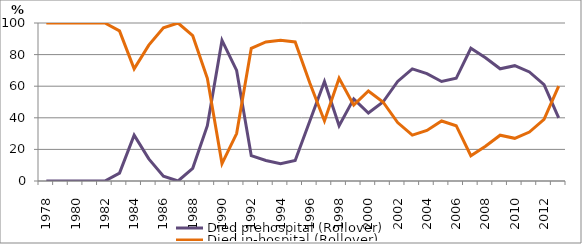
| Category | Died prehospital (Rollover) | Died in-hospital (Rollover) |
|---|---|---|
| 1978.0 | 0 | 100 |
| 1979.0 | 0 | 100 |
| 1980.0 | 0 | 100 |
| 1981.0 | 0 | 100 |
| 1982.0 | 0 | 100 |
| 1983.0 | 5 | 95 |
| 1984.0 | 29 | 71 |
| 1985.0 | 14 | 86 |
| 1986.0 | 3 | 97 |
| 1987.0 | 0 | 100 |
| 1988.0 | 8 | 92 |
| 1989.0 | 35 | 65 |
| 1990.0 | 89 | 11 |
| 1991.0 | 70 | 30 |
| 1992.0 | 16 | 84 |
| 1993.0 | 13 | 88 |
| 1994.0 | 11 | 89 |
| 1995.0 | 13 | 88 |
| 1996.0 | 38 | 62 |
| 1997.0 | 63 | 38 |
| 1998.0 | 35 | 65 |
| 1999.0 | 52 | 48 |
| 2000.0 | 43 | 57 |
| 2001.0 | 50 | 50 |
| 2002.0 | 63 | 37 |
| 2003.0 | 71 | 29 |
| 2004.0 | 68 | 32 |
| 2005.0 | 63 | 38 |
| 2006.0 | 65 | 35 |
| 2007.0 | 84 | 16 |
| 2008.0 | 78 | 22 |
| 2009.0 | 71 | 29 |
| 2010.0 | 73 | 27 |
| 2011.0 | 69 | 31 |
| 2012.0 | 61 | 39 |
| 2013.0 | 40 | 60 |